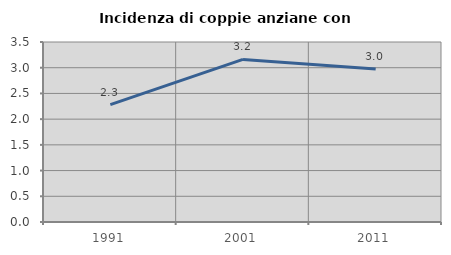
| Category | Incidenza di coppie anziane con figli |
|---|---|
| 1991.0 | 2.283 |
| 2001.0 | 3.162 |
| 2011.0 | 2.973 |